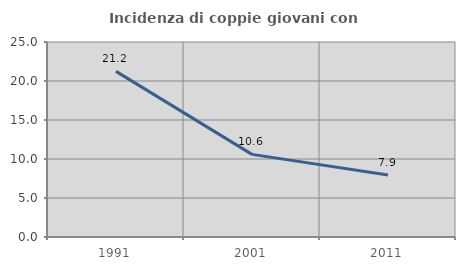
| Category | Incidenza di coppie giovani con figli |
|---|---|
| 1991.0 | 21.235 |
| 2001.0 | 10.593 |
| 2011.0 | 7.948 |